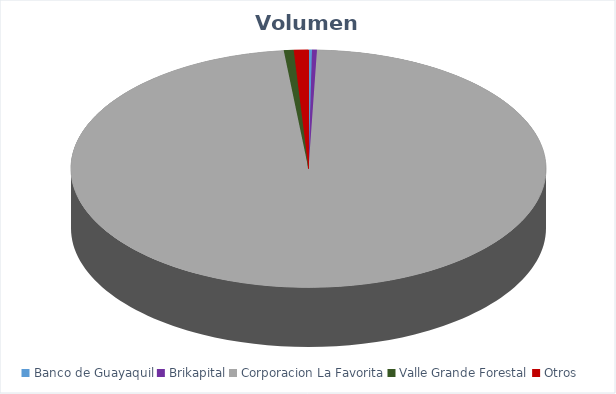
| Category | VOLUMEN ($USD) |
|---|---|
| Banco de Guayaquil | 704.82 |
| Brikapital | 1000 |
| Corporacion La Favorita | 293116.65 |
| Valle Grande Forestal | 2002 |
| Otros | 2969.85 |